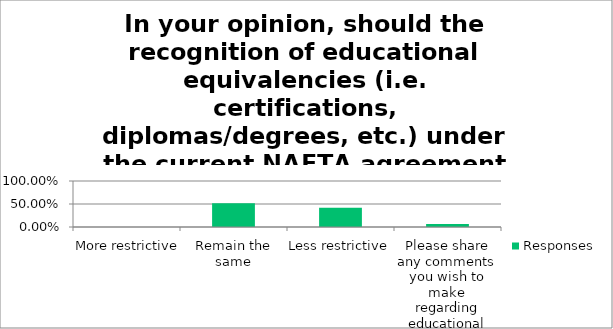
| Category | Responses |
|---|---|
| More restrictive | 0 |
| Remain the same | 0.516 |
| Less restrictive | 0.419 |
| Please share any comments you wish to make regarding educational equivalencies. | 0.064 |